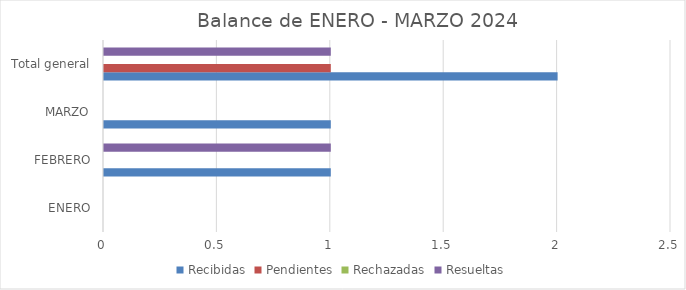
| Category | Recibidas | Pendientes | Rechazadas | Resueltas |
|---|---|---|---|---|
| ENERO | 0 | 0 | 0 | 0 |
| FEBRERO | 1 | 0 | 0 | 1 |
| MARZO | 1 | 0 | 0 | 0 |
| Total general | 2 | 1 | 0 | 1 |